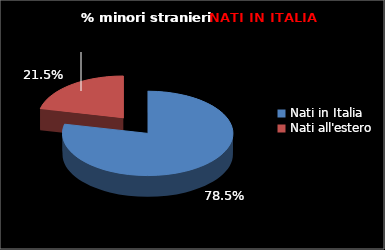
| Category | Series 0 |
|---|---|
| Nati in Italia | 73 |
| Nati all'estero | 20 |